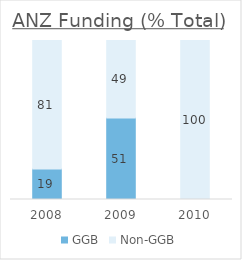
| Category | GGB | Non-GGB |
|---|---|---|
| 2008.0 | 19.219 | 80.781 |
| 2009.0 | 51.273 | 48.727 |
| 2010.0 | 0 | 100 |